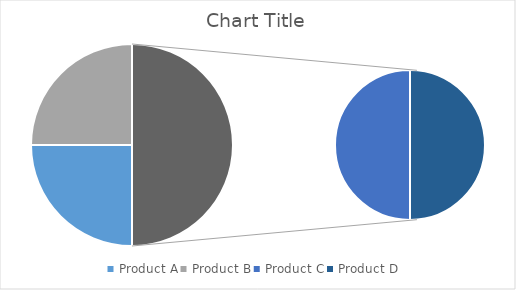
| Category | Series 0 | Series 1 | Series 2 |
|---|---|---|---|
| Product A | 100 | 200 | 300 |
| Product B | 100 | 200 | 300 |
| Product C | 100 | 200 | 300 |
| Product D | 100 | 200 | 300 |